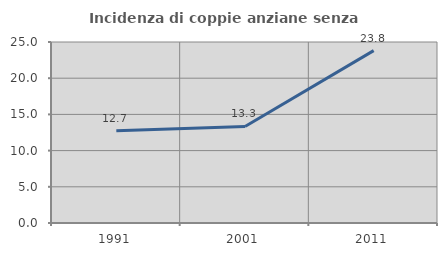
| Category | Incidenza di coppie anziane senza figli  |
|---|---|
| 1991.0 | 12.727 |
| 2001.0 | 13.333 |
| 2011.0 | 23.81 |